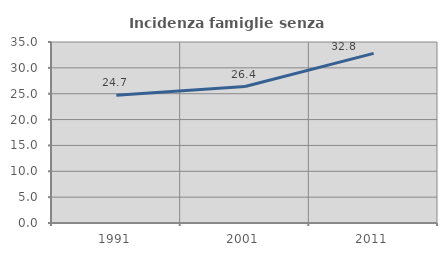
| Category | Incidenza famiglie senza nuclei |
|---|---|
| 1991.0 | 24.684 |
| 2001.0 | 26.389 |
| 2011.0 | 32.798 |